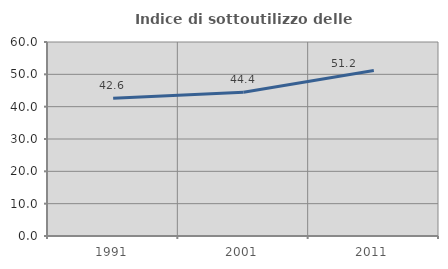
| Category | Indice di sottoutilizzo delle abitazioni  |
|---|---|
| 1991.0 | 42.578 |
| 2001.0 | 44.444 |
| 2011.0 | 51.213 |